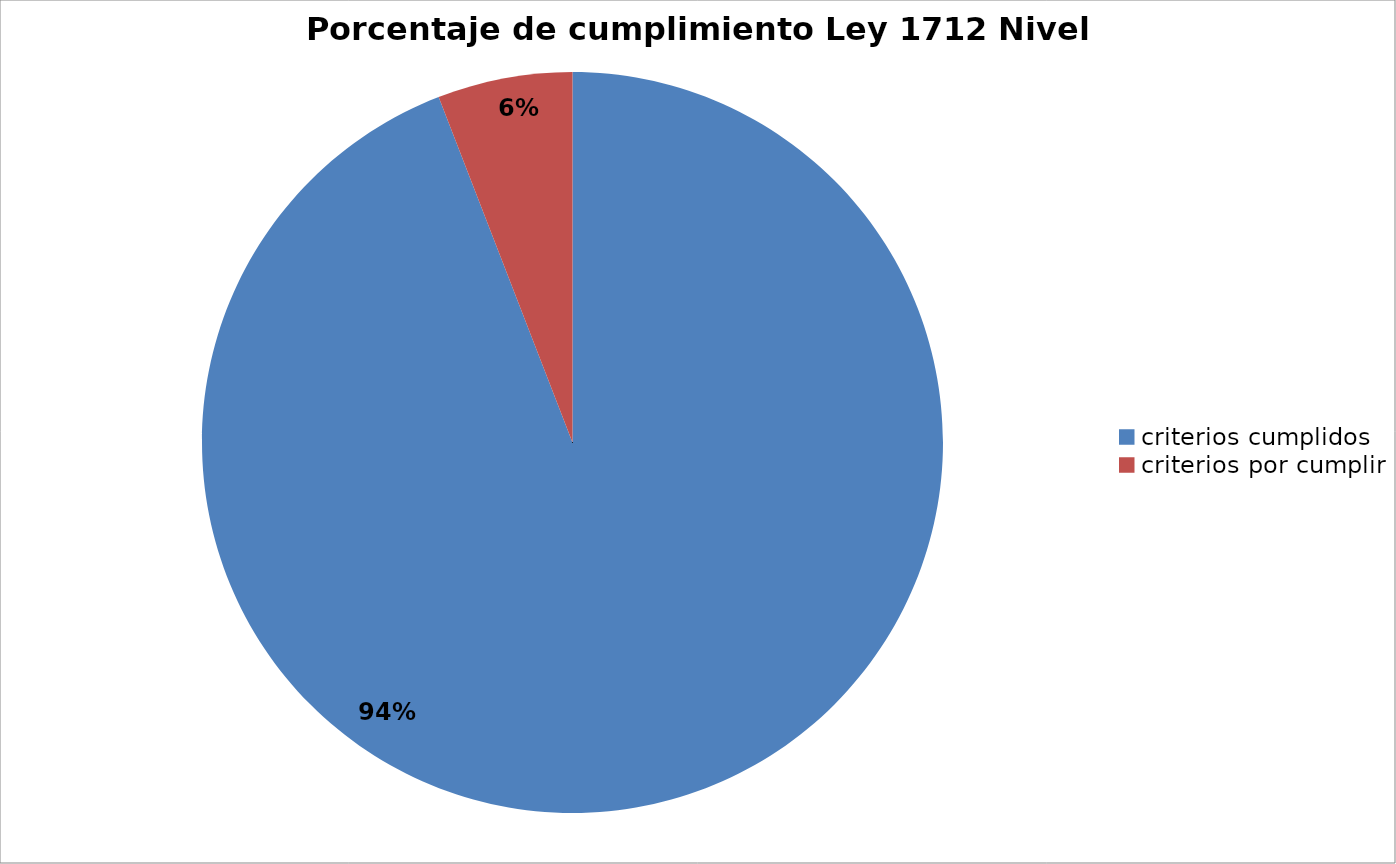
| Category | Series 0 |
|---|---|
| criterios cumplidos | 128 |
| criterios por cumplir | 8 |